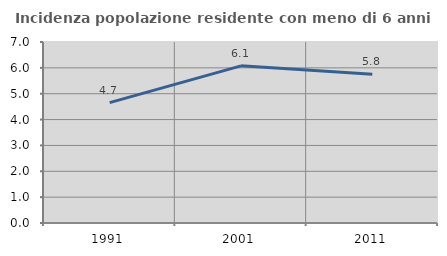
| Category | Incidenza popolazione residente con meno di 6 anni |
|---|---|
| 1991.0 | 4.655 |
| 2001.0 | 6.078 |
| 2011.0 | 5.753 |